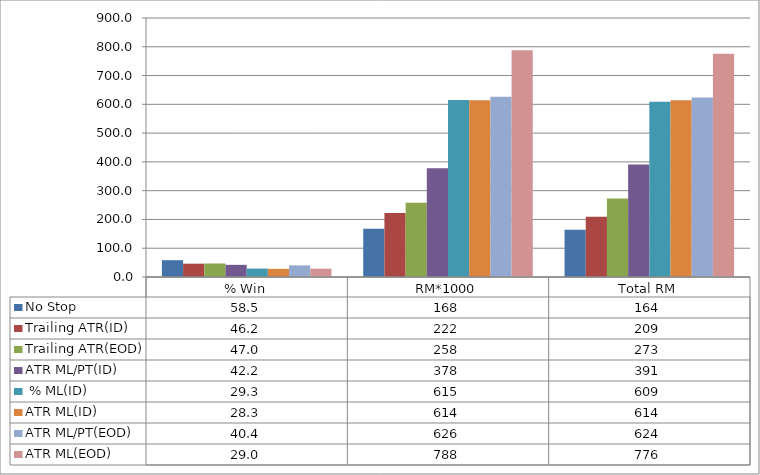
| Category | No Stop | Trailing ATR(ID) | Trailing ATR(EOD) | ATR ML/PT(ID) |  % ML(ID) | ATR ML(ID) | ATR ML/PT(EOD) | ATR ML(EOD) |
|---|---|---|---|---|---|---|---|---|
| % Win | 58.46 | 46.24 | 46.98 | 42.22 | 29.26 | 28.34 | 40.37 | 29.04 |
| RM*1000 | 168 | 222 | 258 | 378 | 615 | 614 | 626 | 788 |
| Total RM | 163.8 | 209 | 273 | 391 | 609 | 614 | 624 | 776 |